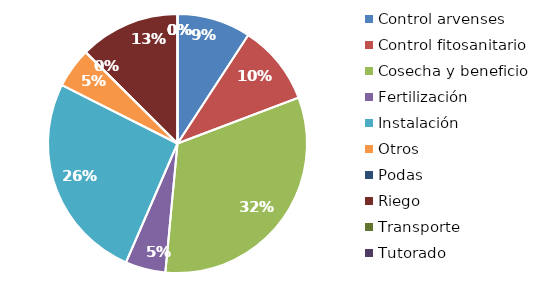
| Category | Valor |
|---|---|
| Control arvenses | 385000 |
| Control fitosanitario | 420000 |
| Cosecha y beneficio | 1350000 |
| Fertilización | 210000 |
| Instalación | 1085000 |
| Otros | 210000 |
| Podas | 0 |
| Riego | 525000 |
| Transporte | 0 |
| Tutorado | 0 |